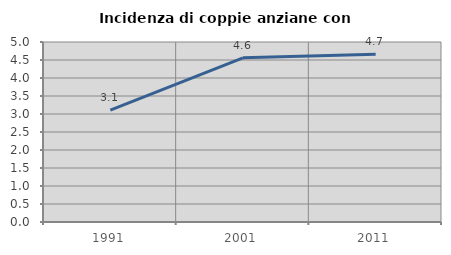
| Category | Incidenza di coppie anziane con figli |
|---|---|
| 1991.0 | 3.107 |
| 2001.0 | 4.561 |
| 2011.0 | 4.659 |